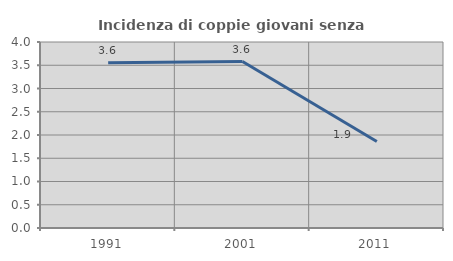
| Category | Incidenza di coppie giovani senza figli |
|---|---|
| 1991.0 | 3.551 |
| 2001.0 | 3.579 |
| 2011.0 | 1.86 |